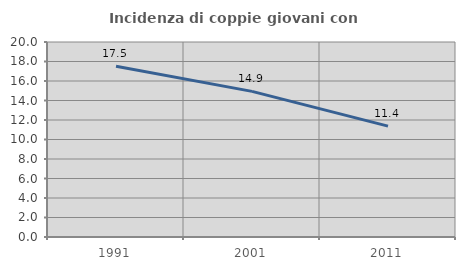
| Category | Incidenza di coppie giovani con figli |
|---|---|
| 1991.0 | 17.521 |
| 2001.0 | 14.937 |
| 2011.0 | 11.373 |